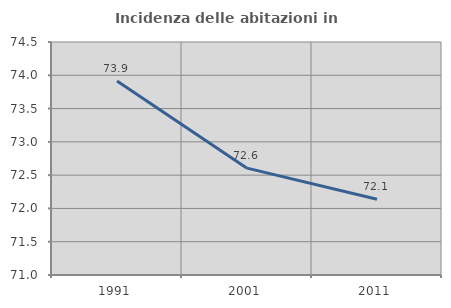
| Category | Incidenza delle abitazioni in proprietà  |
|---|---|
| 1991.0 | 73.913 |
| 2001.0 | 72.605 |
| 2011.0 | 72.139 |